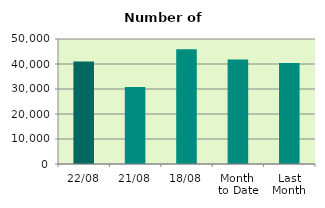
| Category | Series 0 |
|---|---|
| 22/08 | 40978 |
| 21/08 | 30820 |
| 18/08 | 45864 |
| Month 
to Date | 41784.125 |
| Last
Month | 40410.857 |